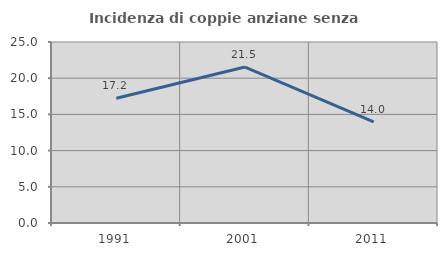
| Category | Incidenza di coppie anziane senza figli  |
|---|---|
| 1991.0 | 17.241 |
| 2001.0 | 21.538 |
| 2011.0 | 13.966 |